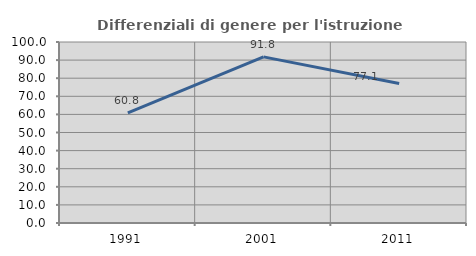
| Category | Differenziali di genere per l'istruzione superiore |
|---|---|
| 1991.0 | 60.793 |
| 2001.0 | 91.777 |
| 2011.0 | 77.074 |